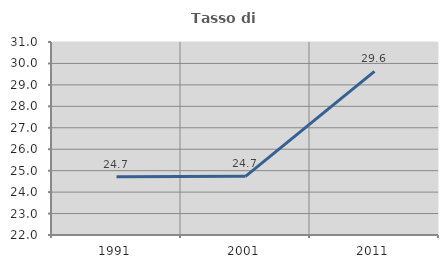
| Category | Tasso di occupazione   |
|---|---|
| 1991.0 | 24.716 |
| 2001.0 | 24.736 |
| 2011.0 | 29.631 |